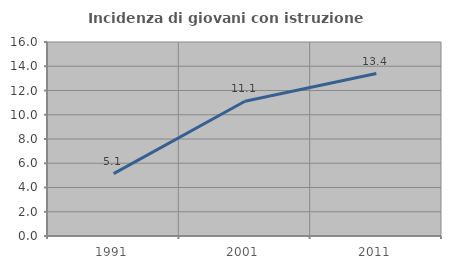
| Category | Incidenza di giovani con istruzione universitaria |
|---|---|
| 1991.0 | 5.147 |
| 2001.0 | 11.111 |
| 2011.0 | 13.402 |